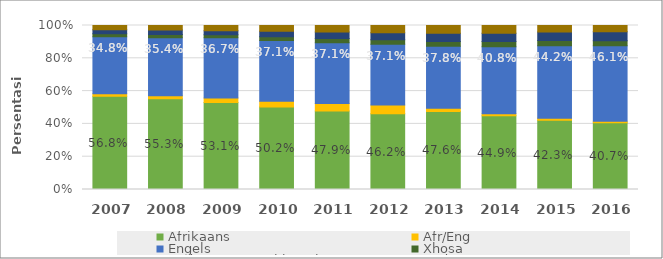
| Category | Afrikaans | Afr/Eng | Engels | Xhosa | Ander SA Amptelike tale | Ander |
|---|---|---|---|---|---|---|
| 2007 | 0.568 | 0.016 | 0.348 | 0.018 | 0.024 | 0.026 |
| 2008 | 0.553 | 0.018 | 0.354 | 0.019 | 0.029 | 0.027 |
| 2009 | 0.531 | 0.028 | 0.367 | 0.017 | 0.026 | 0.031 |
| 2010 | 0.502 | 0.035 | 0.371 | 0.022 | 0.034 | 0.035 |
| 2011 | 0.479 | 0.045 | 0.371 | 0.025 | 0.04 | 0.04 |
| 2012 | 0.462 | 0.053 | 0.371 | 0.028 | 0.043 | 0.044 |
| 2013 | 0.476 | 0.019 | 0.378 | 0.03 | 0.05 | 0.048 |
| 2014 | 0.449 | 0.013 | 0.408 | 0.032 | 0.051 | 0.047 |
| 2015 | 0.423 | 0.011 | 0.442 | 0.032 | 0.053 | 0.039 |
| 2016 | 0.407 | 0.009 | 0.461 | 0.031 | 0.054 | 0.039 |